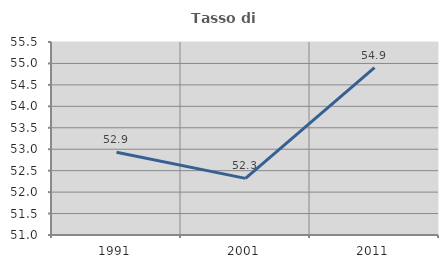
| Category | Tasso di occupazione   |
|---|---|
| 1991.0 | 52.928 |
| 2001.0 | 52.32 |
| 2011.0 | 54.902 |